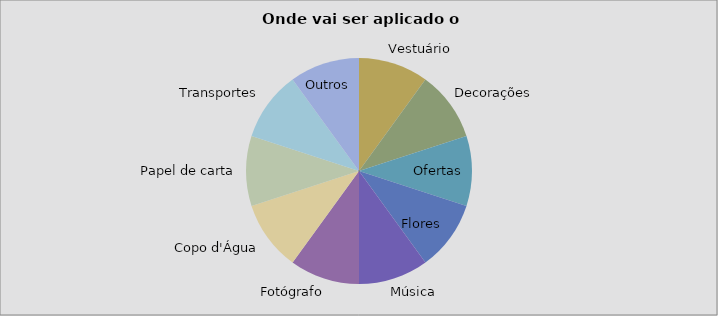
| Category | Valor |
|---|---|
| Vestuário | 1 |
| Decorações | 1 |
| Ofertas | 1 |
| Flores | 1 |
| Música | 1 |
| Fotógrafo | 1 |
| Copo d'Água | 1 |
| Papel de carta | 1 |
| Transportes | 1 |
| Outros | 1 |